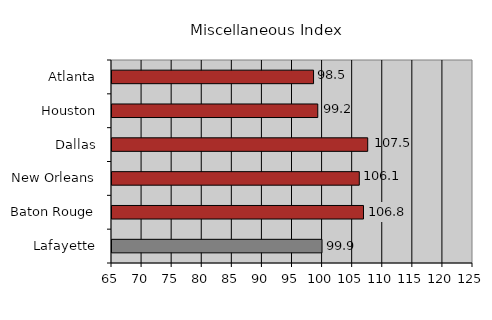
| Category | 99.9 |
|---|---|
| Lafayette | 99.9 |
| Baton Rouge | 106.8 |
| New Orleans | 106.1 |
| Dallas | 107.5 |
| Houston | 99.2 |
| Atlanta | 98.5 |